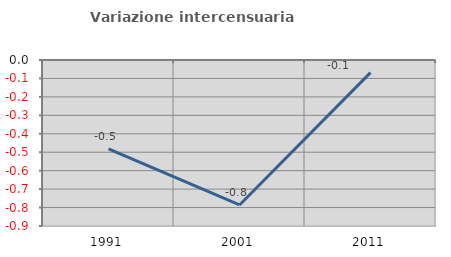
| Category | Variazione intercensuaria annua |
|---|---|
| 1991.0 | -0.482 |
| 2001.0 | -0.786 |
| 2011.0 | -0.069 |